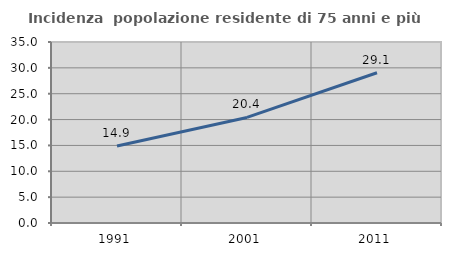
| Category | Incidenza  popolazione residente di 75 anni e più |
|---|---|
| 1991.0 | 14.88 |
| 2001.0 | 20.416 |
| 2011.0 | 29.061 |